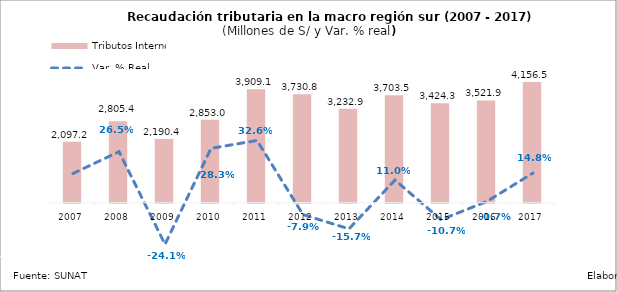
| Category | Tributos Internos |
|---|---|
| 2007.0 | 2097.164 |
| 2008.0 | 2805.389 |
| 2009.0 | 2190.401 |
| 2010.0 | 2852.992 |
| 2011.0 | 3909.139 |
| 2012.0 | 3730.817 |
| 2013.0 | 3232.909 |
| 2014.0 | 3703.542 |
| 2015.0 | 3424.342 |
| 2016.0 | 3521.947 |
| 2017.0 | 4156.508 |